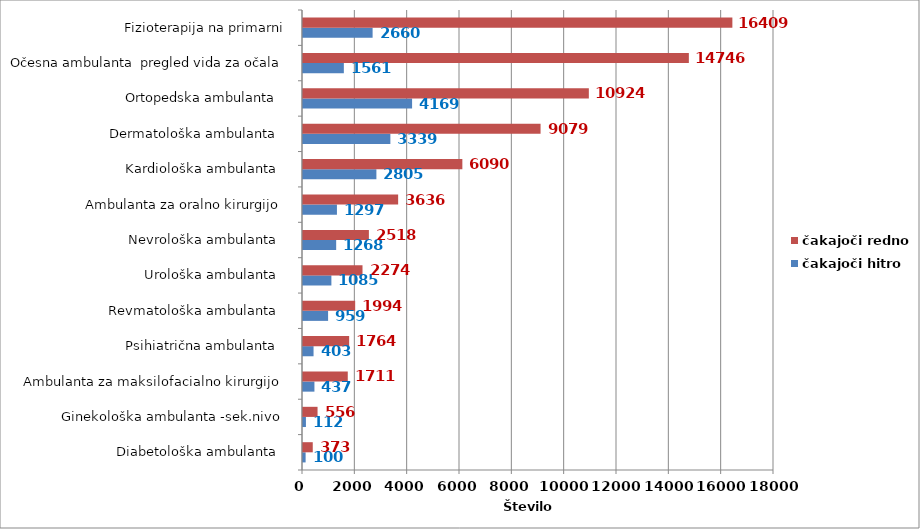
| Category | čakajoči hitro | čakajoči redno |
|---|---|---|
| Diabetološka ambulanta   | 100 | 373 |
| Ginekološka ambulanta -sek.nivo  | 112 | 556 |
| Ambulanta za maksilofacialno kirurgijo  | 437 | 1711 |
| Psihiatrična ambulanta   | 403 | 1764 |
| Revmatološka ambulanta   | 959 | 1994 |
| Urološka ambulanta   | 1085 | 2274 |
| Nevrološka ambulanta   | 1268 | 2518 |
| Ambulanta za oralno kirurgijo  | 1297 | 3636 |
| Kardiološka ambulanta   | 2805 | 6090 |
| Dermatološka ambulanta   | 3339 | 9079 |
| Ortopedska ambulanta   | 4169 | 10924 |
| Očesna ambulanta  pregled vida za očala | 1561 | 14746 |
| Fizioterapija na primarni | 2660 | 16409 |